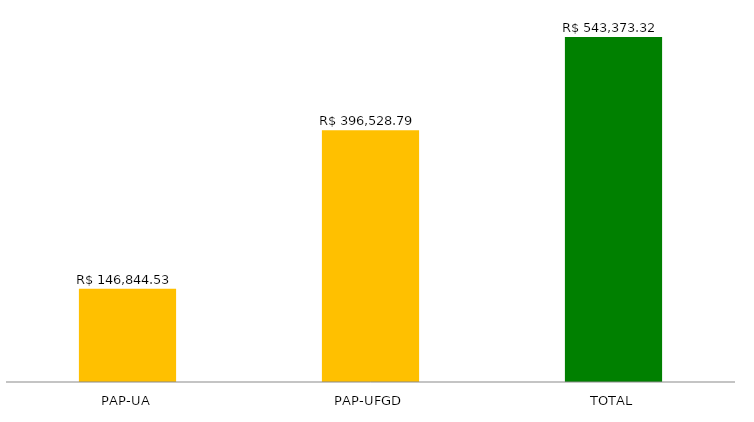
| Category | Series 0 |
|---|---|
| PAP-UA | 146844.53 |
| PAP-UFGD | 396528.79 |
| TOTAL | 543373.32 |